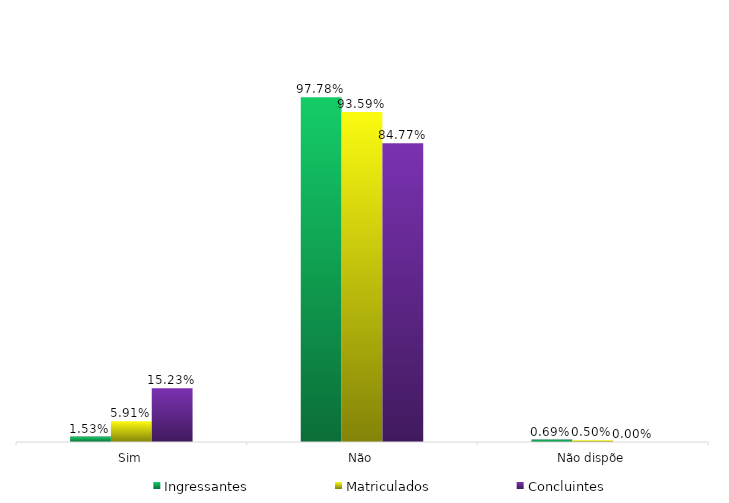
| Category | Ingressantes | Matriculados | Concluintes |
|---|---|---|---|
| Sim | 0.015 | 0.059 | 0.152 |
| Não | 0.978 | 0.936 | 0.848 |
| Não dispõe | 0.007 | 0.005 | 0 |